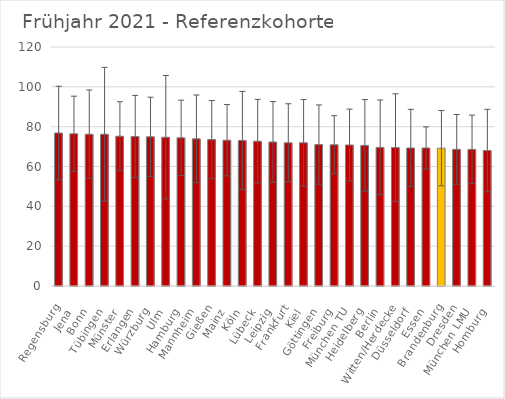
| Category | Mittelwert Ref |
|---|---|
| Regensburg | 76.8 |
| Jena | 76.4 |
| Bonn | 76.2 |
| Tübingen | 76.2 |
| Münster | 75.2 |
| Erlangen | 75.1 |
| Würzburg | 74.9 |
| Ulm | 74.7 |
| Hamburg | 74.4 |
| Mannheim | 73.9 |
| Gießen | 73.5 |
| Mainz | 73.2 |
| Köln | 73.1 |
| Lübeck | 72.7 |
| Leipzig | 72.3 |
| Frankfurt | 71.9 |
| Kiel | 71.9 |
| Göttingen | 71 |
| Freiburg | 70.9 |
| München TU | 70.8 |
| Heidelberg | 70.6 |
| Berlin | 69.6 |
| Witten/Herdecke | 69.5 |
| Düsseldorf | 69.3 |
| Essen | 69.3 |
| Brandenburg | 69.2 |
| Dresden | 68.6 |
| München LMU | 68.6 |
| Homburg | 68 |